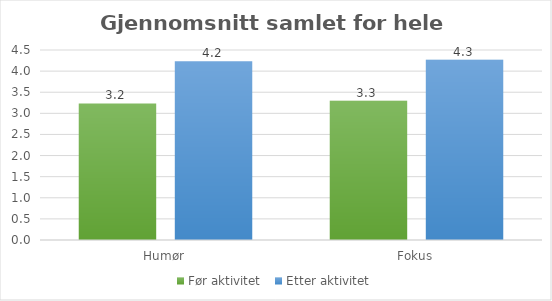
| Category | Før aktivitet  | Etter aktivitet |
|---|---|---|
| Humør | 3.233 | 4.233 |
| Fokus | 3.3 | 4.267 |